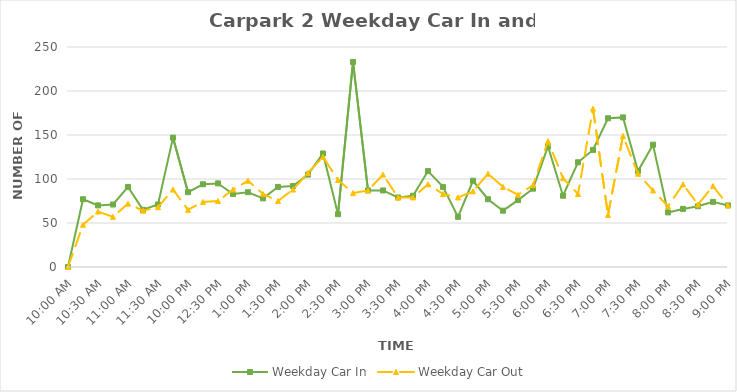
| Category | Weekday Car In | Weekday Car Out |
|---|---|---|
| 0.4166666666666667 | 0 | 0 |
| 0.4270833333333333 | 77 | 48 |
| 0.4375 | 70 | 63 |
| 0.4479166666666667 | 71 | 57 |
| 0.4583333333333333 | 91 | 72 |
| 0.46875 | 65 | 64 |
| 0.4791666666666667 | 71 | 68 |
| 0.4895833333333333 | 147 | 88 |
| 0.5 | 85 | 65 |
| 0.5104166666666666 | 94 | 74 |
| 0.5208333333333334 | 95 | 75 |
| 0.53125 | 83 | 88 |
| 0.5416666666666666 | 85 | 98 |
| 0.5520833333333334 | 78 | 83 |
| 0.5625 | 91 | 75 |
| 0.5729166666666666 | 92 | 88 |
| 0.5833333333333334 | 105 | 107 |
| 0.59375 | 129 | 125 |
| 0.604166666666667 | 60 | 99 |
| 0.614583333333334 | 233 | 84 |
| 0.625 | 87 | 87 |
| 0.635416666666667 | 87 | 105 |
| 0.645833333333334 | 79 | 79 |
| 0.656250000000001 | 81 | 79 |
| 0.666666666666667 | 109 | 94 |
| 0.677083333333334 | 91 | 83 |
| 0.687500000000001 | 57 | 79 |
| 0.697916666666668 | 98 | 86 |
| 0.708333333333335 | 77 | 106 |
| 0.718750000000002 | 64 | 91 |
| 0.729166666666669 | 76 | 82 |
| 0.739583333333336 | 89 | 93 |
| 0.75 | 137 | 143 |
| 0.7604166666666666 | 81 | 101 |
| 0.7708333333333334 | 119 | 83 |
| 0.78125 | 133 | 180 |
| 0.7916666666666666 | 169 | 59 |
| 0.8020833333333334 | 170 | 149 |
| 0.8125 | 109 | 106 |
| 0.8229166666666666 | 139 | 87 |
| 0.8333333333333334 | 62 | 69 |
| 0.84375 | 66 | 94 |
| 0.8541666666666666 | 69 | 71 |
| 0.8645833333333334 | 74 | 92 |
| 0.875 | 70 | 70 |